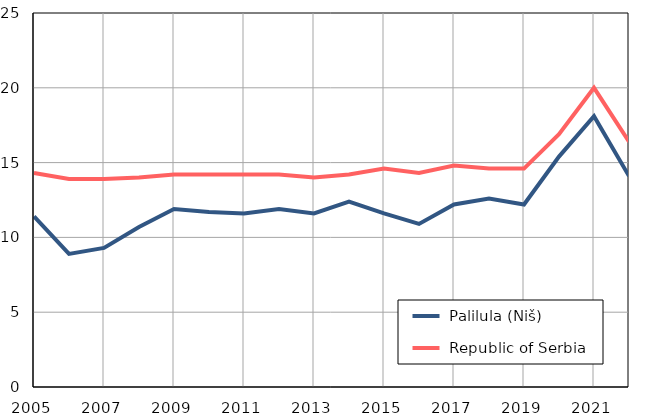
| Category |  Palilula (Niš) |  Republic of Serbia |
|---|---|---|
| 2005.0 | 11.4 | 14.3 |
| 2006.0 | 8.9 | 13.9 |
| 2007.0 | 9.3 | 13.9 |
| 2008.0 | 10.7 | 14 |
| 2009.0 | 11.9 | 14.2 |
| 2010.0 | 11.7 | 14.2 |
| 2011.0 | 11.6 | 14.2 |
| 2012.0 | 11.9 | 14.2 |
| 2013.0 | 11.6 | 14 |
| 2014.0 | 12.4 | 14.2 |
| 2015.0 | 11.6 | 14.6 |
| 2016.0 | 10.9 | 14.3 |
| 2017.0 | 12.2 | 14.8 |
| 2018.0 | 12.6 | 14.6 |
| 2019.0 | 12.2 | 14.6 |
| 2020.0 | 15.4 | 16.9 |
| 2021.0 | 18.1 | 20 |
| 2022.0 | 14.1 | 16.4 |